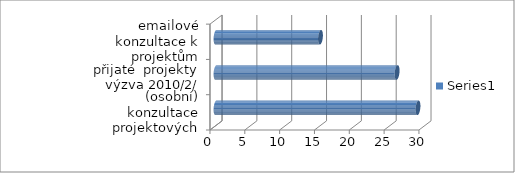
| Category | Series 0 |
|---|---|
| (osobní) konzultace projektových záměrů  | 29 |
| přijaté  projekty výzva 2010/2/ | 26 |
| emailové konzultace k projektům | 15 |